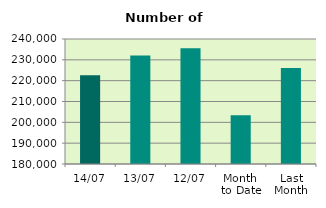
| Category | Series 0 |
|---|---|
| 14/07 | 222634 |
| 13/07 | 232112 |
| 12/07 | 235554 |
| Month 
to Date | 203366 |
| Last
Month | 226069.545 |